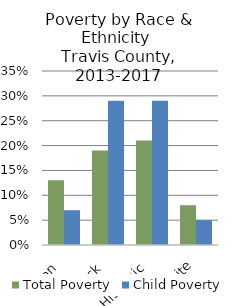
| Category | Total Poverty | Child Poverty |
|---|---|---|
| Asian  | 0.13 | 0.07 |
| Black  | 0.19 | 0.29 |
| Hispanic  | 0.21 | 0.29 |
| White | 0.08 | 0.05 |